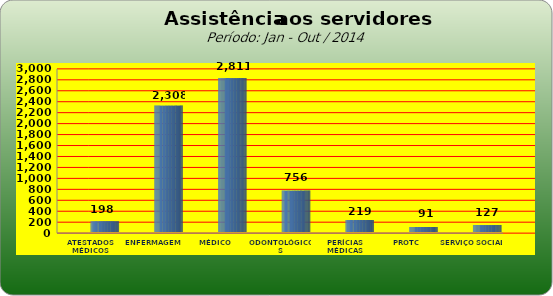
| Category | Series 0 |
|---|---|
| ATESTADOS MÉDICOS | 198 |
| ENFERMAGEM | 2308 |
| MÉDICO | 2811 |
| ODONTOLÓGICOS | 756 |
| PERÍCIAS MÉDICAS | 219 |
| PROTC | 91 |
| SERVIÇO SOCIAL | 127 |